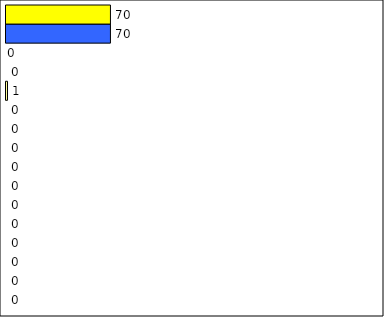
| Category | -2 | -1 | 0 | 1 | 2 | 3 | 4 | 5 | 6 | 7 | 8 | 9 | 10 | 11 | 12 | Perfect Round |
|---|---|---|---|---|---|---|---|---|---|---|---|---|---|---|---|---|
| 0 | 0 | 0 | 0 | 0 | 0 | 0 | 0 | 0 | 0 | 0 | 0 | 1 | 0 | 0 | 70 | 70 |